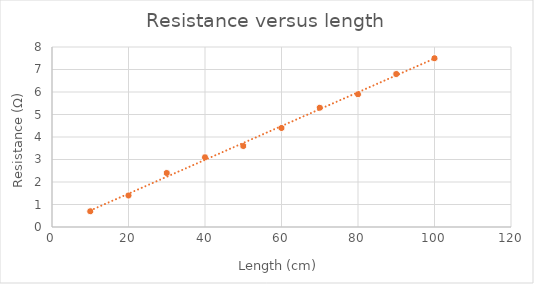
| Category | Resistance (Ω) |
|---|---|
| 100.0 | 7.5 |
| 90.0 | 6.8 |
| 80.0 | 5.9 |
| 70.0 | 5.3 |
| 60.0 | 4.4 |
| 50.0 | 3.6 |
| 40.0 | 3.1 |
| 30.0 | 2.4 |
| 20.0 | 1.4 |
| 10.0 | 0.7 |